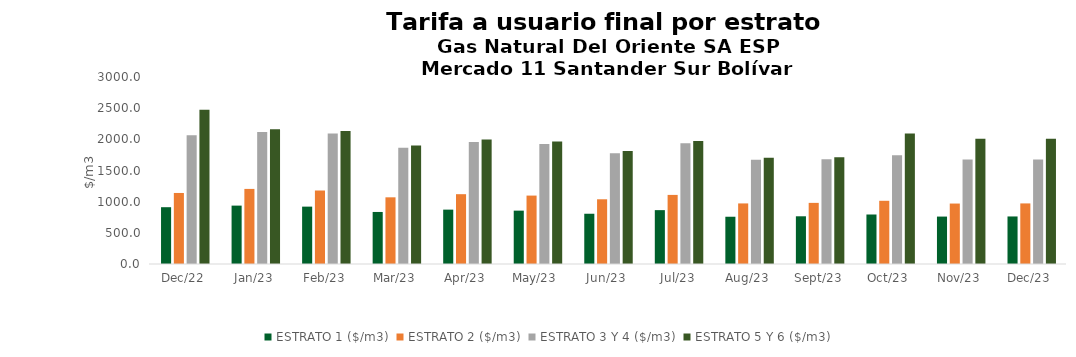
| Category | ESTRATO 1 ($/m3) | ESTRATO 2 ($/m3) | ESTRATO 3 Y 4 ($/m3) | ESTRATO 5 Y 6 ($/m3) |
|---|---|---|---|---|
| 2022-12-01 | 911.27 | 1139.55 | 2063.64 | 2476.368 |
| 2023-01-01 | 936.76 | 1204.6 | 2117.59 | 2159.942 |
| 2023-02-01 | 920.36 | 1179.08 | 2091.73 | 2133.565 |
| 2023-03-01 | 834.84 | 1069.75 | 1864.96 | 1902.259 |
| 2023-04-01 | 872.23 | 1119.98 | 1956.98 | 1996.12 |
| 2023-05-01 | 856.04 | 1097.58 | 1926.46 | 1964.989 |
| 2023-06-01 | 806.28 | 1038.3 | 1778.05 | 1813.611 |
| 2023-07-01 | 864.11 | 1108.42 | 1935.47 | 1974.179 |
| 2023-08-01 | 758.17 | 971.8 | 1672.03 | 1705.471 |
| 2023-09-01 | 765.41 | 980.53 | 1679.03 | 1712.611 |
| 2023-10-01 | 794.12 | 1014.06 | 1746.12 | 2095.344 |
| 2023-11-01 | 760.84 | 969.81 | 1675.45 | 2010.54 |
| 2023-12-01 | 762.7 | 971.9 | 1675 | 2010 |